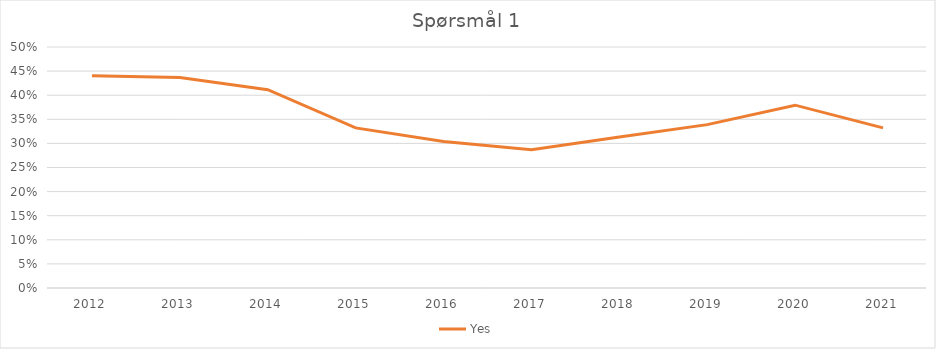
| Category | Yes |
|---|---|
| 2012.0 | 0.44 |
| 2013.0 | 0.437 |
| 2014.0 | 0.411 |
| 2015.0 | 0.332 |
| 2016.0 | 0.304 |
| 2017.0 | 0.287 |
| 2018.0 | 0.313 |
| 2019.0 | 0.339 |
| 2020.0 | 0.379 |
| 2021.0 | 0.332 |